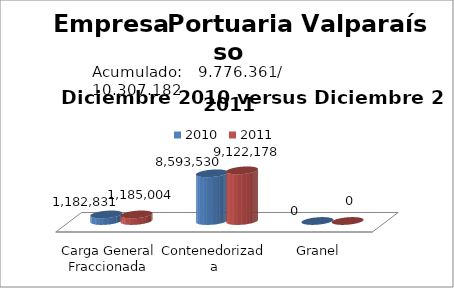
| Category | 2010 | 2011 |
|---|---|---|
| Carga General Fraccionada | 1182831 | 1185004 |
| Contenedorizada | 8593530 | 9122178 |
| Granel | 0 | 0 |